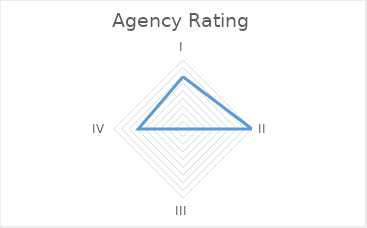
| Category | Series 0 |
|---|---|
| I | 1.364 |
| II | 1.8 |
| III | 0 |
| IV | 1.167 |